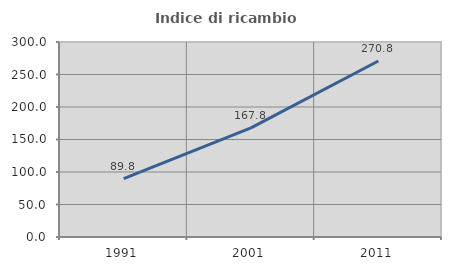
| Category | Indice di ricambio occupazionale  |
|---|---|
| 1991.0 | 89.796 |
| 2001.0 | 167.816 |
| 2011.0 | 270.803 |